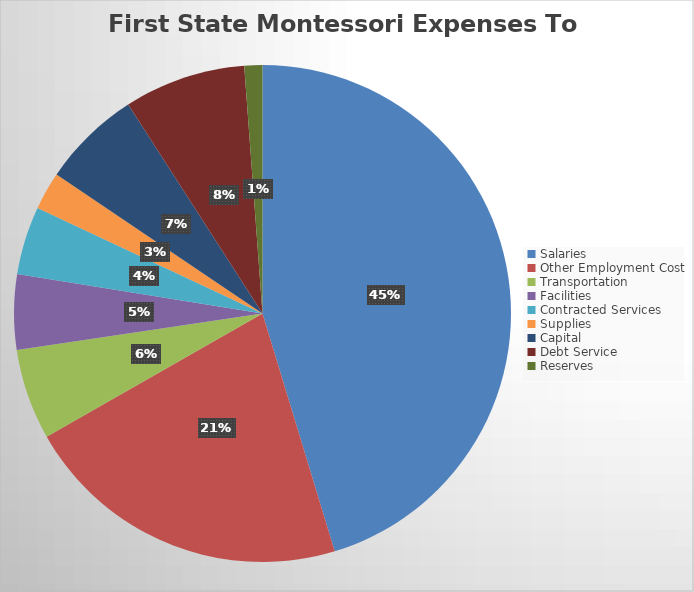
| Category | Series 0 |
|---|---|
| Salaries | 3862433.34 |
| Other Employment Cost | 1827289.29 |
| Transportation | 503112.05 |
| Facilities | 416994.27 |
| Contracted Services | 378974.65 |
| Supplies | 210128.64 |
| Capital | 550939.15 |
| Debt Service | 674600 |
| Reserves | 100000 |